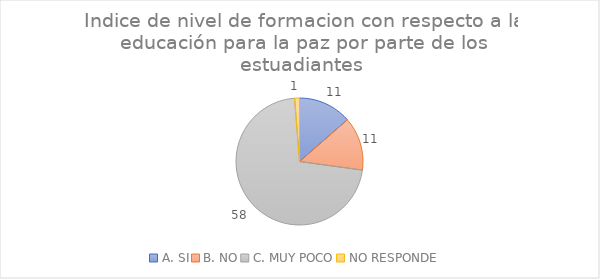
| Category | Series 0 |
|---|---|
| A. SI | 11 |
| B. NO | 11 |
| C. MUY POCO | 58 |
| NO RESPONDE | 1 |